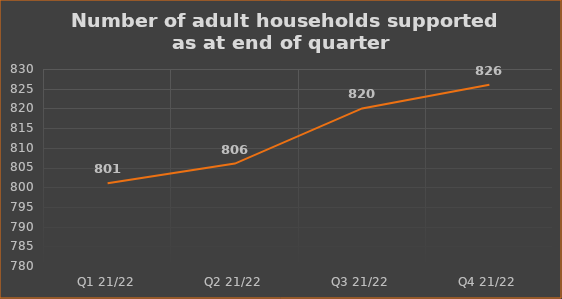
| Category | Number of financially supported households at end of quarter |
|---|---|
| Q1 21/22 | 801 |
| Q2 21/22 | 806 |
| Q3 21/22 | 820 |
| Q4 21/22 | 826 |